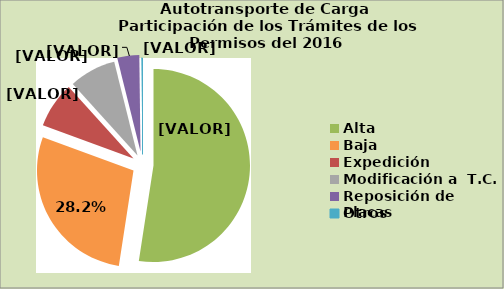
| Category | Series 0 |
|---|---|
| Alta                                         | 52.43 |
| Baja | 28.148 |
| Expedición | 7.722 |
| Modificación a  T.C. | 7.815 |
| Reposición de Placas | 3.69 |
| Otros | 0.195 |